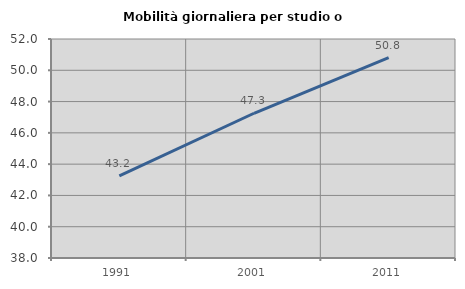
| Category | Mobilità giornaliera per studio o lavoro |
|---|---|
| 1991.0 | 43.245 |
| 2001.0 | 47.253 |
| 2011.0 | 50.81 |